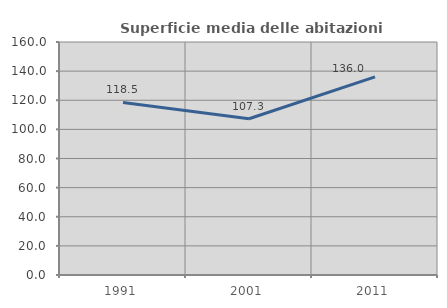
| Category | Superficie media delle abitazioni occupate |
|---|---|
| 1991.0 | 118.511 |
| 2001.0 | 107.299 |
| 2011.0 | 136.023 |